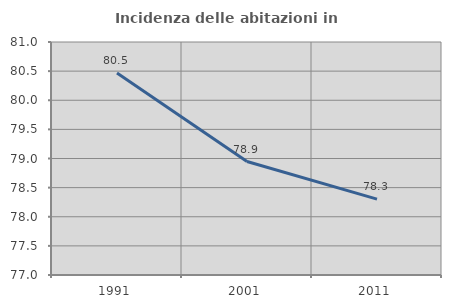
| Category | Incidenza delle abitazioni in proprietà  |
|---|---|
| 1991.0 | 80.466 |
| 2001.0 | 78.947 |
| 2011.0 | 78.302 |